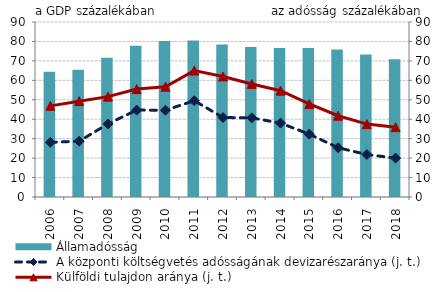
| Category | Államadósság |
|---|---|
| 2006.0 | 64.456 |
| 2007.0 | 65.472 |
| 2008.0 | 71.581 |
| 2009.0 | 77.842 |
| 2010.0 | 80.249 |
| 2011.0 | 80.482 |
| 2012.0 | 78.373 |
| 2013.0 | 77.145 |
| 2014.0 | 76.649 |
| 2015.0 | 76.607 |
| 2016.0 | 75.864 |
| 2017.0 | 73.251 |
| 2018.0 | 70.9 |